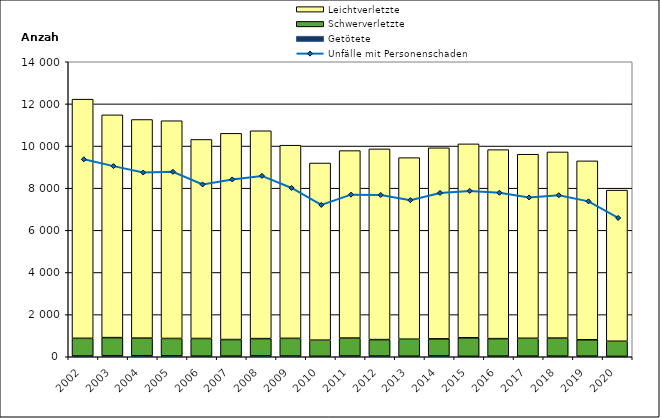
| Category | Getötete | Schwerverletzte | Leichtverletzte |
|---|---|---|---|
| 2002.0 | 34 | 841 | 11350 |
| 2003.0 | 44 | 864 | 10573 |
| 2004.0 | 48 | 836 | 10376 |
| 2005.0 | 43 | 826 | 10332 |
| 2006.0 | 28 | 839 | 9446 |
| 2007.0 | 30 | 787 | 9786 |
| 2008.0 | 40 | 821 | 9864 |
| 2009.0 | 33 | 840 | 9167 |
| 2010.0 | 22 | 765 | 8408 |
| 2011.0 | 34 | 853 | 8897 |
| 2012.0 | 33 | 781 | 9051 |
| 2013.0 | 26 | 808 | 8615 |
| 2014.0 | 38 | 812 | 9066 |
| 2015.0 | 20 | 880 | 9203 |
| 2016.0 | 29 | 831 | 8969 |
| 2017.0 | 28 | 849 | 8734 |
| 2018.0 | 29 | 856 | 8835 |
| 2019.0 | 28 | 778 | 8490 |
| 2020.0 | 15 | 721 | 7173 |